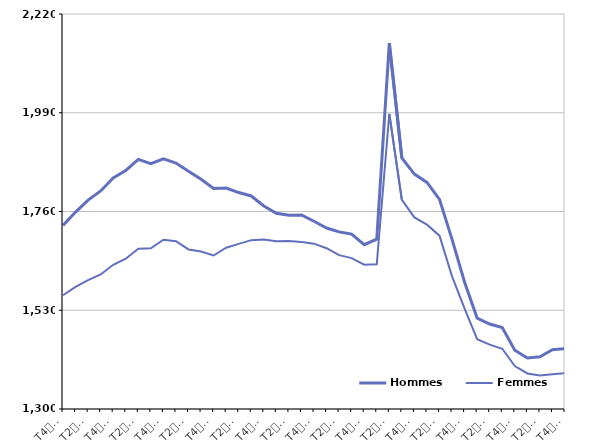
| Category | Hommes  | Femmes  |
|---|---|---|
| T4
2013 | 1727.4 | 1564.9 |
| T1
2014 | 1758.7 | 1584.6 |
| T2
2014 | 1786.4 | 1600.2 |
| T3
2014 | 1807.9 | 1613.4 |
| T4
2014 | 1837.9 | 1636 |
| T1
2015 | 1855.6 | 1650 |
| T2
2015 | 1881.3 | 1673.4 |
| T3
2015 | 1871.3 | 1674.2 |
| T4
2015 | 1882.7 | 1694.1 |
| T1
2016 | 1872.7 | 1690.8 |
| T2
2016 | 1853.5 | 1671.6 |
| T3
2016 | 1835.3 | 1667 |
| T4
2016 | 1813.8 | 1657.5 |
| T1
2017 | 1814.6 | 1675.6 |
| T2
2017 | 1804.1 | 1684.5 |
| T3
2017 | 1796.2 | 1693.3 |
| T4
2017 | 1772.8 | 1694.5 |
| T1
2018 | 1755.9 | 1690.9 |
| T2
2018 | 1751.1 | 1691.5 |
| T3
2018 | 1752 | 1688.8 |
| T4
2018 | 1737.3 | 1685.1 |
| T1
2019 | 1721.5 | 1674.5 |
| T2
2019 | 1712.6 | 1658.4 |
| T3
2019 | 1707.3 | 1651.4 |
| T4
2019 | 1682.6 | 1636.1 |
| T1
2020 | 1695.4 | 1637.2 |
| T2
2020 | 2151.8 | 1987.2 |
| T3
2020 | 1884.9 | 1787.3 |
| T4
2020 | 1847.2 | 1746.2 |
| T1
2021 | 1827.6 | 1729.4 |
| T2
2021 | 1788.2 | 1703.7 |
| T3
2021 | 1695 | 1608.9 |
| T4
2021 | 1595.2 | 1533.6 |
| T1
2022 | 1511.8 | 1462.6 |
| T2
2022 | 1498 | 1449.8 |
| T3
2022 | 1489.5 | 1440.3 |
| T4
2022 | 1436.9 | 1400 |
| T1
2023 | 1418.7 | 1382.8 |
| T2
2023 | 1421.7 | 1377.9 |
| T3
2023 | 1438 | 1380.8 |
| T4
2023 | 1440.8 | 1383.6 |